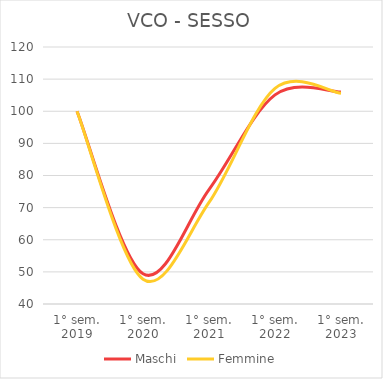
| Category | Maschi | Femmine |
|---|---|---|
| 1° sem.
2019 | 100 | 100 |
| 1° sem.
2020 | 49.411 | 47.737 |
| 1° sem.
2021 | 75.609 | 71.605 |
| 1° sem.
2022 | 105.106 | 107.099 |
| 1° sem.
2023 | 105.97 | 105.59 |